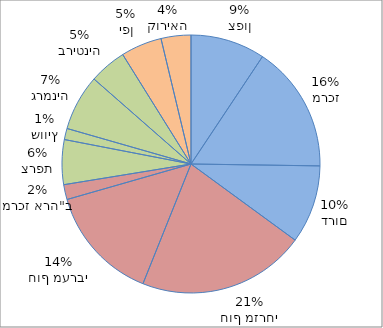
| Category | מכירות לפי איזור |
|---|---|
| צפון | 20 |
| מרכז | 34 |
| דרום | 21 |
| חוף מזרחי | 45 |
| חוף מערבי | 31 |
| מרכז ארה"ב | 4 |
| צרפת | 12 |
| שוויץ | 3 |
| גרמניה | 15 |
| בריטניה | 10 |
| יפן | 11 |
| קוריאה | 8 |